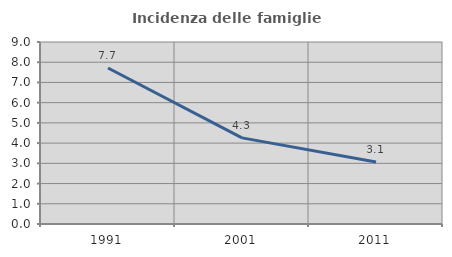
| Category | Incidenza delle famiglie numerose |
|---|---|
| 1991.0 | 7.716 |
| 2001.0 | 4.259 |
| 2011.0 | 3.064 |